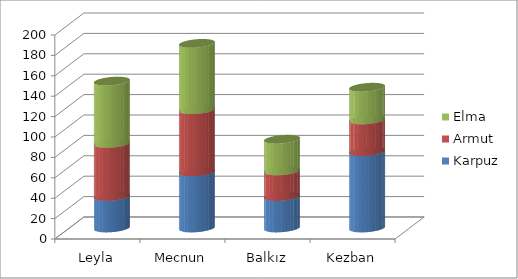
| Category | Karpuz | Armut | Elma |
|---|---|---|---|
| Leyla | 31 | 52 | 61 |
| Mecnun | 55 | 61 | 65 |
| Balkız | 31 | 25 | 31 |
| Kezban | 75 | 31 | 32 |